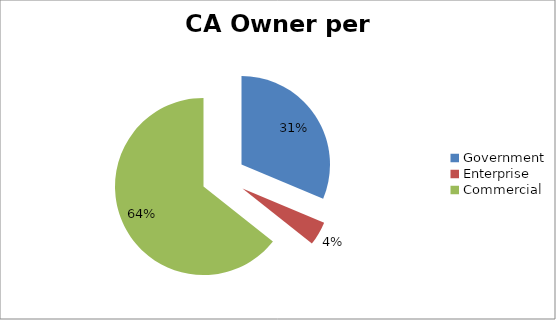
| Category | Series 0 |
|---|---|
| Government | 36 |
| Enterprise | 5 |
| Commercial | 74 |